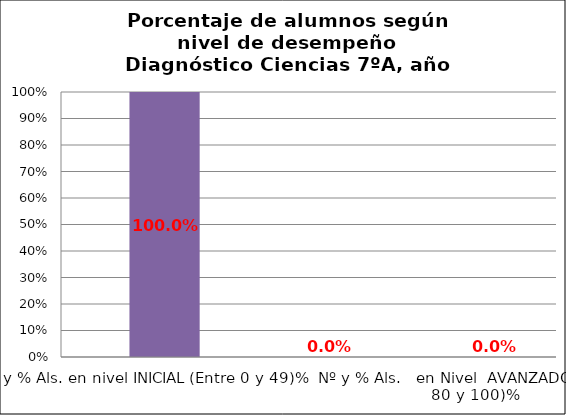
| Category | Series 0 | Series 1 | Series 2 | Series 3 |
|---|---|---|---|---|
| Nº y % Als. en nivel INICIAL (Entre 0 y 49)% |  |  |  | 1 |
| Nº y % Als.   en Nivel    INTERMEDIO (Entre 50 y 79)% |  |  |  | 0 |
| Nº y % Als.   en Nivel  AVANZADO    (Entre 80 y 100)% |  |  |  | 0 |